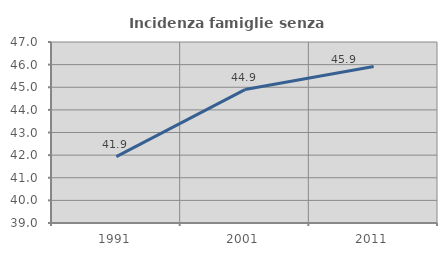
| Category | Incidenza famiglie senza nuclei |
|---|---|
| 1991.0 | 41.935 |
| 2001.0 | 44.898 |
| 2011.0 | 45.918 |